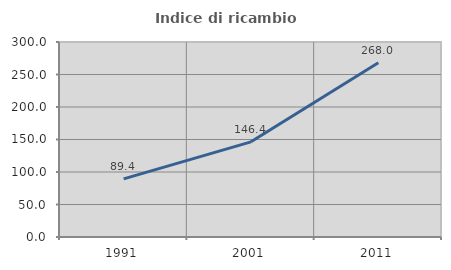
| Category | Indice di ricambio occupazionale  |
|---|---|
| 1991.0 | 89.365 |
| 2001.0 | 146.403 |
| 2011.0 | 268.046 |